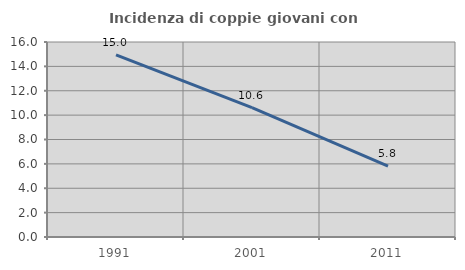
| Category | Incidenza di coppie giovani con figli |
|---|---|
| 1991.0 | 14.95 |
| 2001.0 | 10.608 |
| 2011.0 | 5.808 |